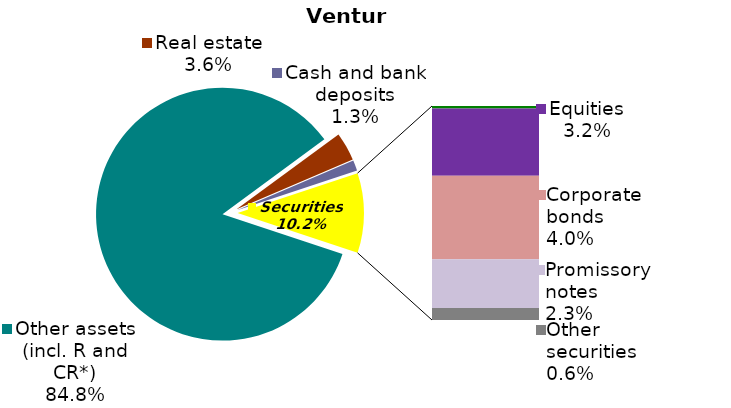
| Category | Series 0 |
|---|---|
| Other assets (incl. R and CR*) | 0.848 |
| Real estate | 0.036 |
| Cash and bank deposits | 0.013 |
| State bonds (OVDP) | 0.001 |
| Equities | 0.032 |
| Corporate bonds | 0.04 |
| Promissory notes | 0.023 |
| Other securities | 0.006 |